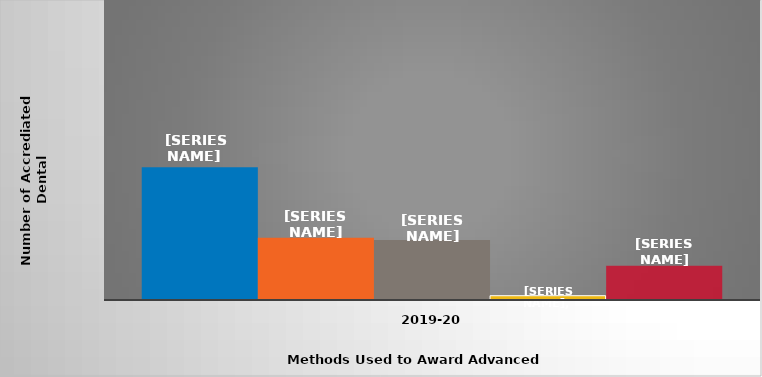
| Category | Transfer of credit | Equivalency examinations | Challenge examinations | Completion of non-accredited dental assisting program at institution | Other |
|---|---|---|---|---|---|
| 2019-20 | 62 | 29 | 28 | 2 | 16 |